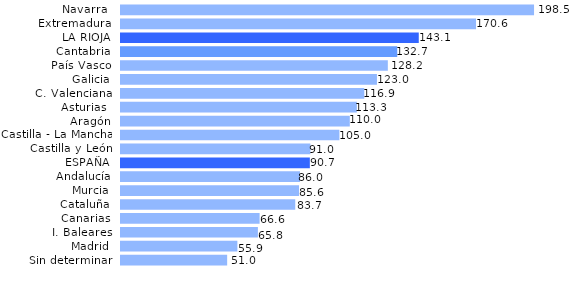
| Category | Series 0 |
|---|---|
| Sin determinar | 51.016 |
| Madrid | 55.921 |
| I. Baleares | 65.783 |
| Canarias | 66.611 |
| Cataluña | 83.731 |
| Murcia | 85.559 |
| Andalucía | 86.002 |
| ESPAÑA | 90.748 |
| Castilla y León | 91.006 |
| Castilla - La Mancha | 104.951 |
| Aragón | 109.951 |
| Asturias  | 113.344 |
| C. Valenciana | 116.909 |
| Galicia | 122.988 |
| País Vasco | 128.226 |
| Cantabria | 132.747 |
| LA RIOJA | 143.095 |
| Extremadura | 170.615 |
| Navarra  | 198.49 |